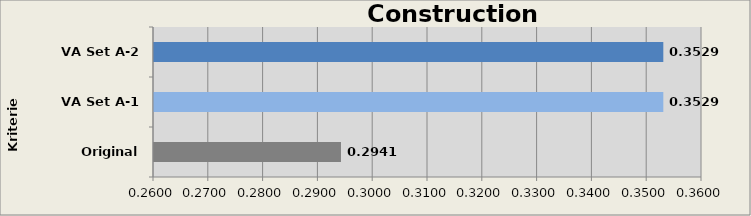
| Category | Construction Impacts |
|---|---|
| Original A-0 | 0.294 |
| VA Set A-1 | 0.353 |
| VA Set A-2 | 0.353 |